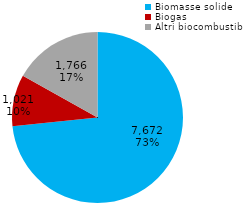
| Category | Series 0 |
|---|---|
| Biomasse solide  | 7672 |
| Biogas | 1021 |
| Altri biocombustibili | 1766 |